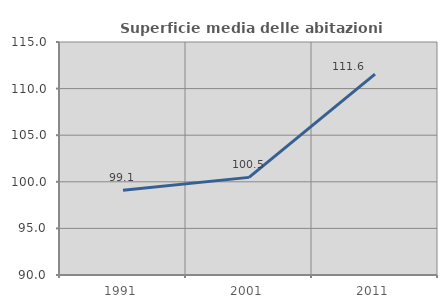
| Category | Superficie media delle abitazioni occupate |
|---|---|
| 1991.0 | 99.102 |
| 2001.0 | 100.475 |
| 2011.0 | 111.555 |